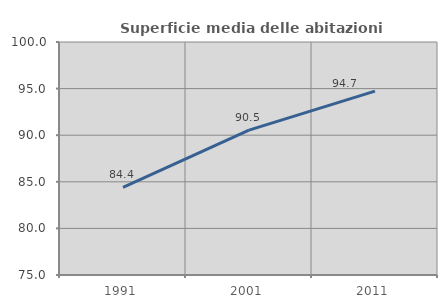
| Category | Superficie media delle abitazioni occupate |
|---|---|
| 1991.0 | 84.397 |
| 2001.0 | 90.546 |
| 2011.0 | 94.725 |